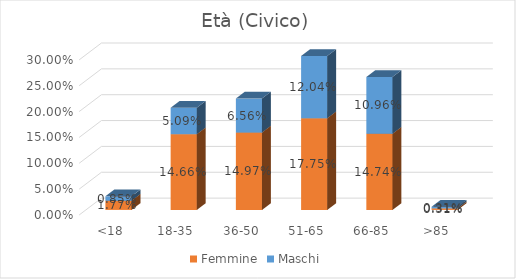
| Category | Femmine | Maschi |
|---|---|---|
| <18 | 0.018 | 0.008 |
| 18-35 | 0.147 | 0.051 |
| 36-50 | 0.15 | 0.066 |
| 51-65 | 0.177 | 0.12 |
| 66-85 | 0.147 | 0.11 |
| >85 | 0.003 | 0.003 |